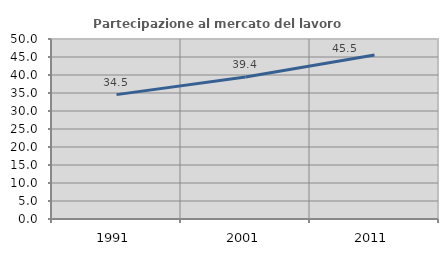
| Category | Partecipazione al mercato del lavoro  femminile |
|---|---|
| 1991.0 | 34.55 |
| 2001.0 | 39.423 |
| 2011.0 | 45.529 |